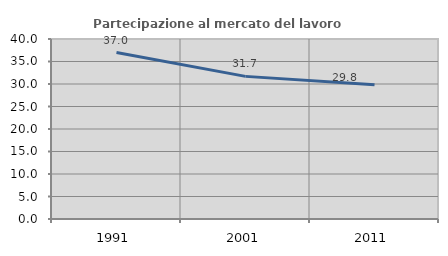
| Category | Partecipazione al mercato del lavoro  femminile |
|---|---|
| 1991.0 | 36.98 |
| 2001.0 | 31.694 |
| 2011.0 | 29.807 |